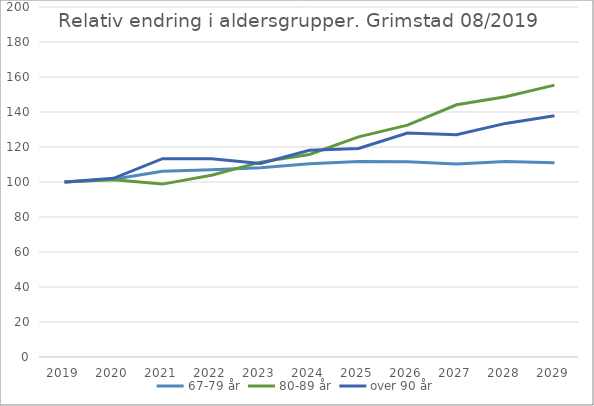
| Category | 67-79 år | 80-89 år | over 90 år |
|---|---|---|---|
| 2019 | 100 | 100 | 100 |
| 2020 | 101.593 | 101.262 | 102.11 |
| 2021 | 106.143 | 98.797 | 113.327 |
| 2022 | 107 | 103.889 | 113.32 |
| 2023 | 108.082 | 111.349 | 110.591 |
| 2024 | 110.435 | 115.716 | 118.132 |
| 2025 | 111.722 | 125.778 | 119.159 |
| 2026 | 111.591 | 132.478 | 128.025 |
| 2027 | 110.241 | 144.102 | 126.977 |
| 2028 | 111.768 | 148.675 | 133.481 |
| 2029 | 111.028 | 155.359 | 137.898 |